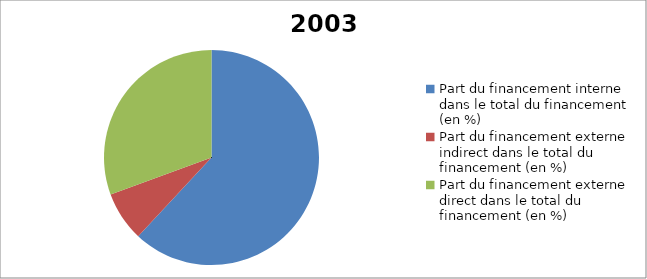
| Category | 2003 |
|---|---|
| Part du financement interne dans le total du financement (en %) | 61.94 |
| Part du financement externe indirect dans le total du financement (en %) | 7.463 |
| Part du financement externe direct dans le total du financement (en %) | 30.597 |